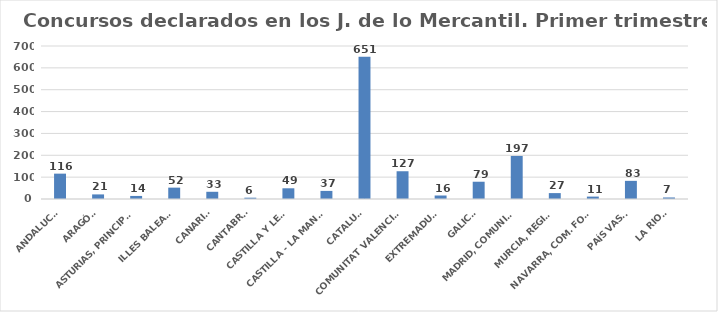
| Category | Series 0 |
|---|---|
| ANDALUCÍA | 116 |
| ARAGÓN | 21 |
| ASTURIAS, PRINCIPADO | 14 |
| ILLES BALEARS | 52 |
| CANARIAS | 33 |
| CANTABRIA | 6 |
| CASTILLA Y LEÓN | 49 |
| CASTILLA - LA MANCHA | 37 |
| CATALUÑA | 651 |
| COMUNITAT VALENCIANA | 127 |
| EXTREMADURA | 16 |
| GALICIA | 79 |
| MADRID, COMUNIDAD | 197 |
| MURCIA, REGIÓN | 27 |
| NAVARRA, COM. FORAL | 11 |
| PAÍS VASCO | 83 |
| LA RIOJA | 7 |